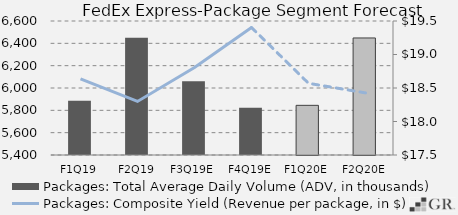
| Category | Packages: Total Average Daily Volume (ADV, in thousands) |
|---|---|
|  F1Q19  | 5886.7 |
|  F2Q19  | 6449.5 |
|  F3Q19E  | 6061.034 |
|  F4Q19E  | 5822.163 |
|  F1Q20E  | 5844.788 |
|  F2Q20E  | 6448.075 |